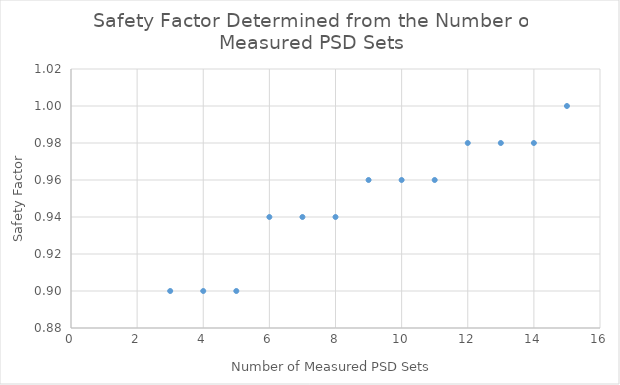
| Category | Series 0 |
|---|---|
| 3.0 | 0.9 |
| 4.0 | 0.9 |
| 5.0 | 0.9 |
| 6.0 | 0.94 |
| 7.0 | 0.94 |
| 8.0 | 0.94 |
| 9.0 | 0.96 |
| 10.0 | 0.96 |
| 11.0 | 0.96 |
| 12.0 | 0.98 |
| 13.0 | 0.98 |
| 14.0 | 0.98 |
| 15.0 | 1 |